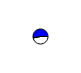
| Category | Series 0 |
|---|---|
| 0 | 2062786 |
| 1 | 2344551 |